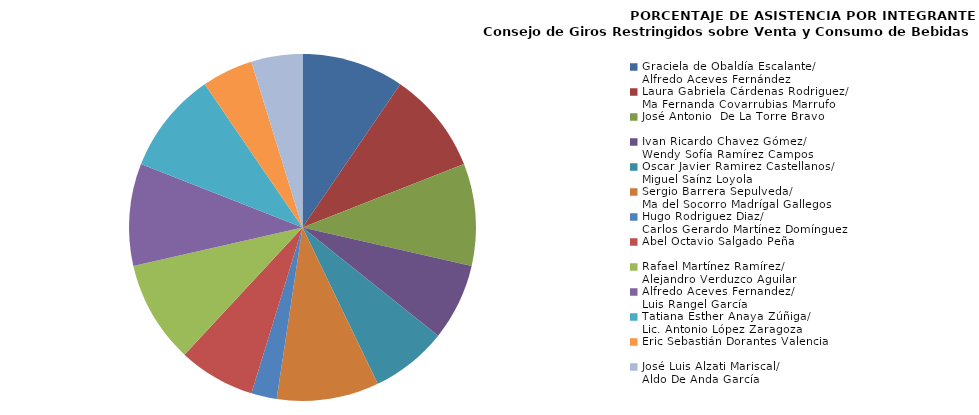
| Category | Series 0 |
|---|---|
| Graciela de Obaldía Escalante/
Alfredo Aceves Fernández | 100 |
| Laura Gabriela Cárdenas Rodriguez/
Ma Fernanda Covarrubias Marrufo  | 100 |
| José Antonio  De La Torre Bravo | 100 |
| Ivan Ricardo Chavez Gómez/
Wendy Sofía Ramírez Campos | 75 |
| Oscar Javier Ramirez Castellanos/
Miguel Saínz Loyola | 75 |
| Sergio Barrera Sepulveda/
Ma del Socorro Madrígal Gallegos | 100 |
| Hugo Rodriguez Diaz/
Carlos Gerardo Martínez Domínguez | 25 |
| Abel Octavio Salgado Peña | 75 |
| Rafael Martínez Ramírez/
Alejandro Verduzco Aguilar | 100 |
| Alfredo Aceves Fernandez/ 
Luis Rangel García | 100 |
| Tatiana Esther Anaya Zúñiga/
Lic. Antonio López Zaragoza | 100 |
| Eric Sebastián Dorantes Valencia | 50 |
| José Luis Alzati Mariscal/
Aldo De Anda García | 50 |